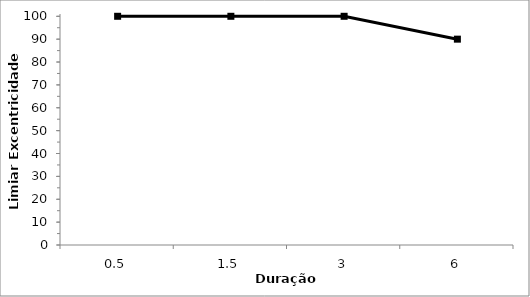
| Category | Series 1 |
|---|---|
| 0.5 | 100 |
| 1.5 | 100 |
| 3.0 | 100 |
| 6.0 | 90 |